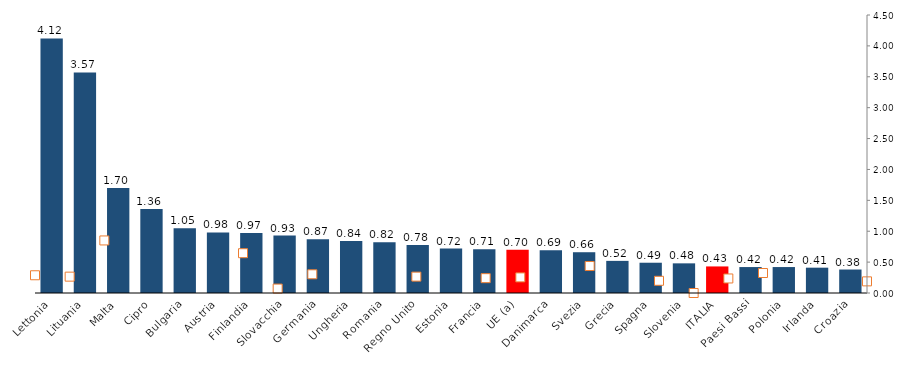
| Category | Series 0 |
|---|---|
| Lettonia | 4.12 |
| Lituania | 3.57 |
| Malta | 1.7 |
| Cipro | 1.36 |
| Bulgaria | 1.05 |
| Austria | 0.98 |
| Finlandia | 0.97 |
| Slovacchia | 0.93 |
| Germania | 0.87 |
| Ungheria | 0.84 |
| Romania | 0.82 |
| Regno Unito | 0.778 |
| Estonia | 0.72 |
| Francia | 0.71 |
| UE (a) | 0.701 |
| Danimarca | 0.69 |
| Svezia | 0.66 |
| Grecia | 0.52 |
| Spagna | 0.49 |
| Slovenia | 0.48 |
| ITALIA | 0.43 |
| Paesi Bassi | 0.42 |
| Polonia | 0.42 |
| Irlanda | 0.41 |
| Croazia | 0.38 |